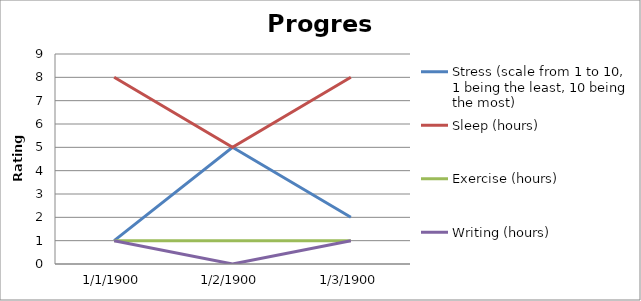
| Category | Stress (scale from 1 to 10, 1 being the least, 10 being the most) | Sleep (hours) | Exercise (hours) | Writing (hours) |
|---|---|---|---|---|
| 0 | 1 | 8 | 1 | 1 |
| 1 | 5 | 5 | 1 | 0 |
| 2 | 2 | 8 | 1 | 1 |